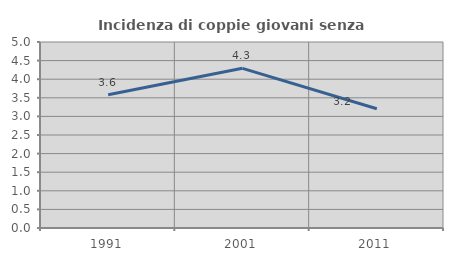
| Category | Incidenza di coppie giovani senza figli |
|---|---|
| 1991.0 | 3.582 |
| 2001.0 | 4.293 |
| 2011.0 | 3.205 |